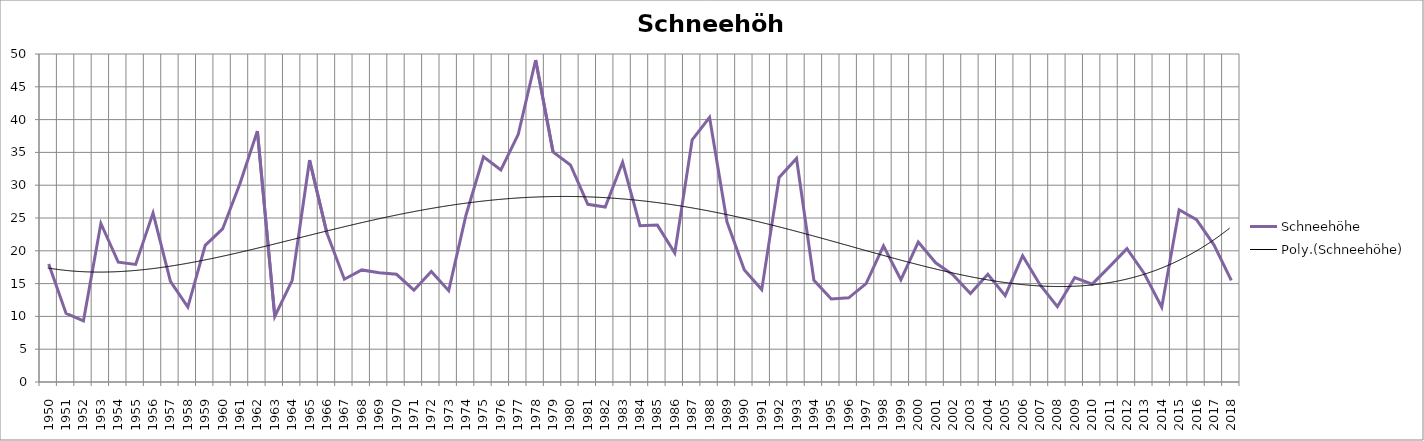
| Category | Schneehöhe |
|---|---|
| 1950.0 | 18 |
| 1951.0 | 10.455 |
| 1952.0 | 9.333 |
| 1953.0 | 24.167 |
| 1954.0 | 18.273 |
| 1955.0 | 17.917 |
| 1956.0 | 25.75 |
| 1957.0 | 15.333 |
| 1958.0 | 11.417 |
| 1959.0 | 20.833 |
| 1960.0 | 23.333 |
| 1961.0 | 30.25 |
| 1962.0 | 38.25 |
| 1963.0 | 10 |
| 1964.0 | 15.5 |
| 1965.0 | 33.833 |
| 1966.0 | 22.667 |
| 1967.0 | 15.667 |
| 1968.0 | 17.083 |
| 1969.0 | 16.667 |
| 1970.0 | 16.417 |
| 1971.0 | 14 |
| 1972.0 | 16.833 |
| 1973.0 | 13.917 |
| 1974.0 | 25.5 |
| 1975.0 | 34.333 |
| 1976.0 | 32.333 |
| 1977.0 | 37.75 |
| 1978.0 | 49.083 |
| 1979.0 | 35.083 |
| 1980.0 | 33.083 |
| 1981.0 | 27.083 |
| 1982.0 | 26.667 |
| 1983.0 | 33.5 |
| 1984.0 | 23.833 |
| 1985.0 | 23.917 |
| 1986.0 | 19.667 |
| 1987.0 | 36.917 |
| 1988.0 | 40.333 |
| 1989.0 | 24.417 |
| 1990.0 | 17.083 |
| 1991.0 | 14.083 |
| 1992.0 | 31.167 |
| 1993.0 | 34.083 |
| 1994.0 | 15.5 |
| 1995.0 | 12.667 |
| 1996.0 | 12.833 |
| 1997.0 | 15 |
| 1998.0 | 20.75 |
| 1999.0 | 15.583 |
| 2000.0 | 21.333 |
| 2001.0 | 18.167 |
| 2002.0 | 16.333 |
| 2003.0 | 13.5 |
| 2004.0 | 16.417 |
| 2005.0 | 13.167 |
| 2006.0 | 19.25 |
| 2007.0 | 14.833 |
| 2008.0 | 11.5 |
| 2009.0 | 15.917 |
| 2010.0 | 14.917 |
| 2011.0 | 17.583 |
| 2012.0 | 20.333 |
| 2013.0 | 16.5 |
| 2014.0 | 11.417 |
| 2015.0 | 26.25 |
| 2016.0 | 24.75 |
| 2017.0 | 20.917 |
| 2018.0 | 15.5 |